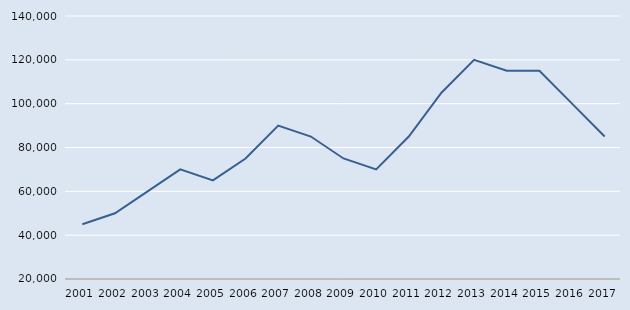
| Category | Série nova |
|---|---|
| 2001.0 | 45000 |
| 2002.0 | 50000 |
| 2003.0 | 60000 |
| 2004.0 | 70000 |
| 2005.0 | 65000 |
| 2006.0 | 75000 |
| 2007.0 | 90000 |
| 2008.0 | 85000 |
| 2009.0 | 75000 |
| 2010.0 | 70000 |
| 2011.0 | 85000 |
| 2012.0 | 105000 |
| 2013.0 | 120000 |
| 2014.0 | 115000 |
| 2015.0 | 115000 |
| 2016.0 | 100000 |
| 2017.0 | 85000 |